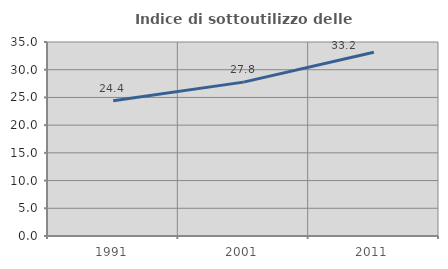
| Category | Indice di sottoutilizzo delle abitazioni  |
|---|---|
| 1991.0 | 24.389 |
| 2001.0 | 27.761 |
| 2011.0 | 33.154 |